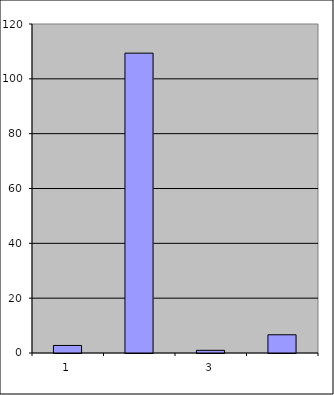
| Category | Series 0 |
|---|---|
| 0 | 2.75 |
| 1 | 109.367 |
| 2 | 0.975 |
| 3 | 6.648 |